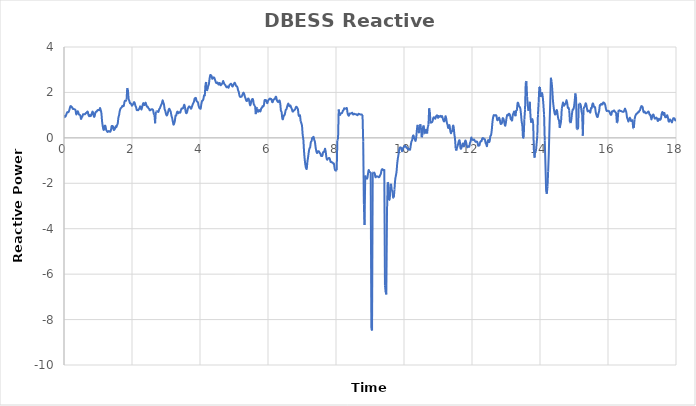
| Category | DBESS Reactive Power |
|---|---|
| 0.0 | 0.878 |
| 0.02 | 0.966 |
| 0.04 | 0.932 |
| 0.06 | 0.997 |
| 0.08 | 1.076 |
| 0.1 | 1.132 |
| 0.12 | 1.124 |
| 0.14 | 1.153 |
| 0.16 | 1.243 |
| 0.18 | 1.361 |
| 0.2 | 1.404 |
| 0.22 | 1.347 |
| 0.24 | 1.347 |
| 0.26 | 1.275 |
| 0.28 | 1.269 |
| 0.3 | 1.263 |
| 0.32 | 1.252 |
| 0.34 | 1.208 |
| 0.36 | 1.034 |
| 0.38 | 1.099 |
| 0.4 | 1.171 |
| 0.42 | 1.126 |
| 0.44 | 1.027 |
| 0.46 | 1.012 |
| 0.48 | 0.981 |
| 0.5 | 0.832 |
| 0.52 | 0.903 |
| 0.54 | 0.94 |
| 0.56 | 1.035 |
| 0.58 | 1.041 |
| 0.6 | 1.039 |
| 0.62 | 1.04 |
| 0.64 | 1.088 |
| 0.66 | 1.098 |
| 0.68 | 1.147 |
| 0.7 | 1.147 |
| 0.72 | 1.008 |
| 0.74 | 0.95 |
| 0.76 | 1.01 |
| 0.78 | 0.957 |
| 0.8 | 0.99 |
| 0.82 | 1.088 |
| 0.84 | 1.162 |
| 0.86 | 1.098 |
| 0.88 | 0.935 |
| 0.9 | 0.951 |
| 0.92 | 1.085 |
| 0.94 | 1.15 |
| 0.96 | 1.156 |
| 0.98 | 1.206 |
| 1.0 | 1.229 |
| 1.02 | 1.222 |
| 1.04 | 1.222 |
| 1.06 | 1.32 |
| 1.08 | 1.219 |
| 1.1 | 1.084 |
| 1.12 | 0.727 |
| 1.14 | 0.509 |
| 1.16 | 0.364 |
| 1.18 | 0.369 |
| 1.2 | 0.525 |
| 1.22 | 0.511 |
| 1.24 | 0.357 |
| 1.26 | 0.303 |
| 1.28 | 0.26 |
| 1.3 | 0.276 |
| 1.32 | 0.302 |
| 1.34 | 0.28 |
| 1.36 | 0.267 |
| 1.38 | 0.333 |
| 1.4 | 0.508 |
| 1.42 | 0.522 |
| 1.44 | 0.502 |
| 1.46 | 0.357 |
| 1.48 | 0.357 |
| 1.5 | 0.407 |
| 1.52 | 0.507 |
| 1.54 | 0.47 |
| 1.56 | 0.559 |
| 1.58 | 0.63 |
| 1.6 | 0.886 |
| 1.62 | 1.002 |
| 1.64 | 1.183 |
| 1.66 | 1.277 |
| 1.68 | 1.32 |
| 1.7 | 1.352 |
| 1.72 | 1.408 |
| 1.74 | 1.396 |
| 1.76 | 1.419 |
| 1.78 | 1.59 |
| 1.8 | 1.637 |
| 1.82 | 1.63 |
| 1.84 | 1.674 |
| 1.86 | 2.188 |
| 1.88 | 2.115 |
| 1.9 | 1.73 |
| 1.92 | 1.637 |
| 1.94 | 1.529 |
| 1.96 | 1.518 |
| 1.98 | 1.475 |
| 2.0 | 1.413 |
| 2.02 | 1.462 |
| 2.04 | 1.506 |
| 2.06 | 1.574 |
| 2.08 | 1.532 |
| 2.1 | 1.416 |
| 2.12 | 1.346 |
| 2.14 | 1.229 |
| 2.16 | 1.227 |
| 2.18 | 1.216 |
| 2.2 | 1.255 |
| 2.22 | 1.296 |
| 2.24 | 1.39 |
| 2.26 | 1.311 |
| 2.28 | 1.25 |
| 2.3 | 1.369 |
| 2.32 | 1.484 |
| 2.34 | 1.529 |
| 2.36 | 1.449 |
| 2.38 | 1.465 |
| 2.4 | 1.552 |
| 2.42 | 1.458 |
| 2.44 | 1.376 |
| 2.46 | 1.373 |
| 2.48 | 1.313 |
| 2.5 | 1.282 |
| 2.52 | 1.215 |
| 2.54 | 1.216 |
| 2.56 | 1.252 |
| 2.58 | 1.253 |
| 2.6 | 1.255 |
| 2.62 | 1.217 |
| 2.64 | 1.062 |
| 2.66 | 1.024 |
| 2.68 | 0.639 |
| 2.7 | 1.142 |
| 2.72 | 1.165 |
| 2.74 | 1.174 |
| 2.76 | 1.151 |
| 2.78 | 1.146 |
| 2.8 | 1.266 |
| 2.82 | 1.302 |
| 2.84 | 1.383 |
| 2.86 | 1.455 |
| 2.88 | 1.523 |
| 2.9 | 1.652 |
| 2.92 | 1.562 |
| 2.94 | 1.472 |
| 2.96 | 1.265 |
| 2.98 | 1.185 |
| 3.0 | 1.056 |
| 3.02 | 0.987 |
| 3.04 | 1.022 |
| 3.06 | 1.133 |
| 3.08 | 1.245 |
| 3.1 | 1.281 |
| 3.12 | 1.208 |
| 3.14 | 1.143 |
| 3.16 | 0.972 |
| 3.18 | 0.877 |
| 3.2 | 0.715 |
| 3.22 | 0.584 |
| 3.24 | 0.633 |
| 3.26 | 0.748 |
| 3.28 | 0.974 |
| 3.3 | 0.982 |
| 3.32 | 1.113 |
| 3.34 | 1.156 |
| 3.36 | 1.086 |
| 3.38 | 1.119 |
| 3.4 | 1.126 |
| 3.42 | 1.113 |
| 3.44 | 1.22 |
| 3.46 | 1.292 |
| 3.48 | 1.292 |
| 3.5 | 1.306 |
| 3.52 | 1.388 |
| 3.54 | 1.458 |
| 3.56 | 1.331 |
| 3.58 | 1.137 |
| 3.6 | 1.08 |
| 3.62 | 1.129 |
| 3.64 | 1.268 |
| 3.66 | 1.342 |
| 3.68 | 1.382 |
| 3.7 | 1.372 |
| 3.72 | 1.318 |
| 3.74 | 1.284 |
| 3.76 | 1.361 |
| 3.78 | 1.452 |
| 3.8 | 1.525 |
| 3.82 | 1.578 |
| 3.84 | 1.721 |
| 3.86 | 1.751 |
| 3.88 | 1.751 |
| 3.9 | 1.625 |
| 3.92 | 1.592 |
| 3.94 | 1.554 |
| 3.96 | 1.409 |
| 3.98 | 1.319 |
| 4.0 | 1.297 |
| 4.02 | 1.29 |
| 4.04 | 1.496 |
| 4.06 | 1.623 |
| 4.08 | 1.641 |
| 4.1 | 1.713 |
| 4.12 | 1.867 |
| 4.14 | 1.831 |
| 4.16 | 2.347 |
| 4.18 | 2.458 |
| 4.2 | 2.07 |
| 4.22 | 2.124 |
| 4.24 | 2.276 |
| 4.26 | 2.355 |
| 4.28 | 2.592 |
| 4.3 | 2.757 |
| 4.32 | 2.757 |
| 4.34 | 2.723 |
| 4.36 | 2.605 |
| 4.38 | 2.618 |
| 4.4 | 2.66 |
| 4.42 | 2.645 |
| 4.44 | 2.564 |
| 4.46 | 2.475 |
| 4.48 | 2.411 |
| 4.5 | 2.425 |
| 4.52 | 2.432 |
| 4.54 | 2.352 |
| 4.56 | 2.372 |
| 4.58 | 2.418 |
| 4.6 | 2.325 |
| 4.62 | 2.326 |
| 4.64 | 2.367 |
| 4.66 | 2.409 |
| 4.68 | 2.504 |
| 4.7 | 2.434 |
| 4.72 | 2.367 |
| 4.74 | 2.33 |
| 4.76 | 2.279 |
| 4.78 | 2.227 |
| 4.8 | 2.25 |
| 4.82 | 2.255 |
| 4.84 | 2.208 |
| 4.86 | 2.302 |
| 4.88 | 2.346 |
| 4.9 | 2.376 |
| 4.92 | 2.375 |
| 4.94 | 2.29 |
| 4.96 | 2.261 |
| 4.98 | 2.325 |
| 5.0 | 2.385 |
| 5.02 | 2.43 |
| 5.04 | 2.378 |
| 5.06 | 2.291 |
| 5.08 | 2.27 |
| 5.1 | 2.229 |
| 5.12 | 2.099 |
| 5.14 | 2.022 |
| 5.16 | 1.867 |
| 5.18 | 1.805 |
| 5.2 | 1.812 |
| 5.22 | 1.812 |
| 5.24 | 1.861 |
| 5.26 | 1.946 |
| 5.28 | 1.992 |
| 5.3 | 1.928 |
| 5.32 | 1.812 |
| 5.34 | 1.732 |
| 5.36 | 1.645 |
| 5.38 | 1.622 |
| 5.4 | 1.688 |
| 5.42 | 1.738 |
| 5.44 | 1.688 |
| 5.46 | 1.516 |
| 5.48 | 1.43 |
| 5.5 | 1.538 |
| 5.52 | 1.671 |
| 5.54 | 1.708 |
| 5.56 | 1.687 |
| 5.58 | 1.498 |
| 5.6 | 1.433 |
| 5.62 | 1.411 |
| 5.64 | 1.045 |
| 5.66 | 1.341 |
| 5.68 | 1.293 |
| 5.7 | 1.159 |
| 5.72 | 1.164 |
| 5.74 | 1.226 |
| 5.76 | 1.186 |
| 5.78 | 1.171 |
| 5.8 | 1.294 |
| 5.82 | 1.319 |
| 5.84 | 1.393 |
| 5.86 | 1.377 |
| 5.88 | 1.445 |
| 5.9 | 1.653 |
| 5.92 | 1.663 |
| 5.94 | 1.661 |
| 5.96 | 1.591 |
| 5.98 | 1.527 |
| 6.0 | 1.624 |
| 6.02 | 1.675 |
| 6.04 | 1.709 |
| 6.06 | 1.732 |
| 6.08 | 1.702 |
| 6.1 | 1.703 |
| 6.12 | 1.582 |
| 6.14 | 1.582 |
| 6.16 | 1.669 |
| 6.18 | 1.699 |
| 6.2 | 1.712 |
| 6.22 | 1.79 |
| 6.24 | 1.804 |
| 6.26 | 1.662 |
| 6.28 | 1.601 |
| 6.3 | 1.571 |
| 6.32 | 1.617 |
| 6.34 | 1.645 |
| 6.36 | 1.51 |
| 6.38 | 1.196 |
| 6.4 | 1.139 |
| 6.42 | 0.863 |
| 6.44 | 0.823 |
| 6.46 | 0.968 |
| 6.48 | 0.983 |
| 6.5 | 1.068 |
| 6.52 | 1.224 |
| 6.54 | 1.252 |
| 6.56 | 1.362 |
| 6.58 | 1.459 |
| 6.6 | 1.506 |
| 6.62 | 1.41 |
| 6.64 | 1.388 |
| 6.66 | 1.426 |
| 6.68 | 1.336 |
| 6.7 | 1.274 |
| 6.72 | 1.168 |
| 6.74 | 1.161 |
| 6.76 | 1.208 |
| 6.78 | 1.226 |
| 6.8 | 1.261 |
| 6.82 | 1.353 |
| 6.84 | 1.366 |
| 6.86 | 1.315 |
| 6.88 | 1.258 |
| 6.9 | 1.007 |
| 6.92 | 0.961 |
| 6.94 | 1.024 |
| 6.96 | 0.738 |
| 6.98 | 0.65 |
| 7.0 | 0.528 |
| 7.02 | 0.138 |
| 7.04 | -0.087 |
| 7.06 | -0.588 |
| 7.08 | -0.95 |
| 7.1 | -1.198 |
| 7.12 | -1.338 |
| 7.14 | -1.351 |
| 7.16 | -1.045 |
| 7.18 | -0.842 |
| 7.2 | -0.612 |
| 7.22 | -0.463 |
| 7.24 | -0.41 |
| 7.26 | -0.19 |
| 7.28 | -0.148 |
| 7.3 | -0.006 |
| 7.32 | -0.001 |
| 7.34 | 0.043 |
| 7.36 | -0.092 |
| 7.38 | -0.176 |
| 7.4 | -0.41 |
| 7.42 | -0.579 |
| 7.44 | -0.671 |
| 7.46 | -0.6 |
| 7.48 | -0.586 |
| 7.5 | -0.599 |
| 7.52 | -0.672 |
| 7.54 | -0.684 |
| 7.56 | -0.791 |
| 7.58 | -0.797 |
| 7.6 | -0.785 |
| 7.62 | -0.637 |
| 7.64 | -0.621 |
| 7.66 | -0.575 |
| 7.68 | -0.48 |
| 7.7 | -0.648 |
| 7.72 | -0.883 |
| 7.74 | -0.962 |
| 7.76 | -0.922 |
| 7.78 | -0.897 |
| 7.8 | -0.887 |
| 7.82 | -0.932 |
| 7.84 | -1.056 |
| 7.86 | -1.056 |
| 7.88 | -1.082 |
| 7.9 | -1.087 |
| 7.92 | -1.131 |
| 7.94 | -1.147 |
| 7.96 | -1.353 |
| 7.98 | -1.428 |
| 8.0 | -1.442 |
| 8.02 | -1.426 |
| 8.04 | -0.112 |
| 8.06 | -0.062 |
| 8.08 | 1.251 |
| 8.1 | 1.021 |
| 8.12 | 1.005 |
| 8.14 | 1.074 |
| 8.16 | 1.088 |
| 8.18 | 1.099 |
| 8.2 | 1.19 |
| 8.22 | 1.21 |
| 8.24 | 1.3 |
| 8.26 | 1.282 |
| 8.28 | 1.288 |
| 8.3 | 1.304 |
| 8.32 | 1.302 |
| 8.34 | 1.088 |
| 8.36 | 1.001 |
| 8.38 | 0.978 |
| 8.4 | 1.069 |
| 8.42 | 1.066 |
| 8.44 | 1.073 |
| 8.46 | 1.087 |
| 8.48 | 1.104 |
| 8.5 | 1.033 |
| 8.52 | 1.038 |
| 8.54 | 1.058 |
| 8.56 | 1.041 |
| 8.58 | 1.04 |
| 8.6 | 1.034 |
| 8.62 | 1.004 |
| 8.64 | 1.004 |
| 8.66 | 1.056 |
| 8.68 | 1.052 |
| 8.7 | 1.039 |
| 8.72 | 1.03 |
| 8.74 | 1.03 |
| 8.76 | 1.025 |
| 8.78 | 1.003 |
| 8.8 | -0.155 |
| 8.82 | -2.933 |
| 8.84 | -3.838 |
| 8.86 | -1.66 |
| 8.88 | -1.788 |
| 8.9 | -1.788 |
| 8.92 | -1.783 |
| 8.94 | -1.595 |
| 8.96 | -1.419 |
| 8.98 | -1.483 |
| 9.0 | -1.509 |
| 9.02 | -1.509 |
| 9.04 | -8.409 |
| 9.06 | -8.478 |
| 9.08 | -1.54 |
| 9.1 | -1.515 |
| 9.12 | -1.531 |
| 9.14 | -1.568 |
| 9.16 | -1.735 |
| 9.18 | -1.692 |
| 9.2 | -1.702 |
| 9.22 | -1.697 |
| 9.24 | -1.708 |
| 9.26 | -1.736 |
| 9.28 | -1.711 |
| 9.3 | -1.639 |
| 9.32 | -1.572 |
| 9.34 | -1.421 |
| 9.36 | -1.377 |
| 9.38 | -1.404 |
| 9.4 | -1.425 |
| 9.42 | -1.38 |
| 9.44 | -6.492 |
| 9.46 | -6.787 |
| 9.48 | -6.893 |
| 9.5 | -3.263 |
| 9.52 | -1.956 |
| 9.54 | -2.004 |
| 9.56 | -2.75 |
| 9.58 | -2.724 |
| 9.6 | -2.148 |
| 9.62 | -2.023 |
| 9.64 | -2.293 |
| 9.66 | -2.364 |
| 9.68 | -2.621 |
| 9.7 | -2.63 |
| 9.72 | -2.273 |
| 9.74 | -1.862 |
| 9.76 | -1.671 |
| 9.78 | -1.5 |
| 9.8 | -1.142 |
| 9.82 | -0.899 |
| 9.84 | -0.718 |
| 9.86 | -0.502 |
| 9.88 | -0.426 |
| 9.9 | -0.426 |
| 9.92 | -0.449 |
| 9.94 | -0.588 |
| 9.96 | -0.532 |
| 9.98 | -0.437 |
| 10.0 | -0.405 |
| 10.02 | -0.352 |
| 10.04 | -0.362 |
| 10.06 | -0.403 |
| 10.08 | -0.442 |
| 10.1 | -0.458 |
| 10.12 | -0.518 |
| 10.14 | -0.49 |
| 10.16 | -0.509 |
| 10.18 | -0.514 |
| 10.2 | -0.316 |
| 10.22 | -0.16 |
| 10.24 | -0.093 |
| 10.26 | 0.069 |
| 10.28 | 0.105 |
| 10.3 | -0.016 |
| 10.32 | -0.064 |
| 10.34 | -0.131 |
| 10.36 | 0.027 |
| 10.38 | 0.368 |
| 10.4 | 0.572 |
| 10.42 | 0.314 |
| 10.44 | 0.239 |
| 10.46 | 0.408 |
| 10.48 | 0.599 |
| 10.5 | 0.444 |
| 10.52 | 0.026 |
| 10.54 | 0.104 |
| 10.56 | 0.452 |
| 10.58 | 0.546 |
| 10.6 | 0.186 |
| 10.62 | 0.188 |
| 10.64 | 0.342 |
| 10.66 | 0.338 |
| 10.68 | 0.192 |
| 10.7 | 0.484 |
| 10.72 | 0.578 |
| 10.74 | 1.301 |
| 10.76 | 1.158 |
| 10.78 | 0.638 |
| 10.8 | 0.72 |
| 10.82 | 0.685 |
| 10.84 | 0.738 |
| 10.86 | 0.873 |
| 10.88 | 0.908 |
| 10.9 | 0.881 |
| 10.92 | 0.843 |
| 10.94 | 0.934 |
| 10.96 | 0.982 |
| 10.98 | 0.982 |
| 11.0 | 0.881 |
| 11.02 | 0.958 |
| 11.04 | 0.93 |
| 11.06 | 0.942 |
| 11.08 | 0.969 |
| 11.1 | 0.917 |
| 11.12 | 0.956 |
| 11.14 | 0.852 |
| 11.16 | 0.76 |
| 11.18 | 0.722 |
| 11.2 | 0.783 |
| 11.22 | 0.953 |
| 11.24 | 0.86 |
| 11.26 | 0.672 |
| 11.28 | 0.579 |
| 11.3 | 0.434 |
| 11.32 | 0.509 |
| 11.34 | 0.551 |
| 11.36 | 0.313 |
| 11.38 | 0.199 |
| 11.4 | 0.281 |
| 11.42 | 0.309 |
| 11.44 | 0.527 |
| 11.46 | 0.483 |
| 11.48 | 0.173 |
| 11.5 | -0.046 |
| 11.52 | -0.473 |
| 11.54 | -0.559 |
| 11.56 | -0.425 |
| 11.58 | -0.339 |
| 11.6 | -0.213 |
| 11.62 | -0.116 |
| 11.64 | -0.139 |
| 11.66 | -0.441 |
| 11.68 | -0.475 |
| 11.7 | -0.398 |
| 11.72 | -0.272 |
| 11.74 | -0.259 |
| 11.76 | -0.377 |
| 11.78 | -0.297 |
| 11.8 | -0.129 |
| 11.82 | -0.156 |
| 11.84 | -0.292 |
| 11.86 | -0.412 |
| 11.88 | -0.387 |
| 11.9 | -0.37 |
| 11.92 | -0.386 |
| 11.94 | -0.225 |
| 11.96 | -0.151 |
| 11.98 | 0.013 |
| 12.0 | -0.065 |
| 12.02 | -0.091 |
| 12.04 | -0.088 |
| 12.06 | -0.074 |
| 12.08 | -0.12 |
| 12.1 | -0.168 |
| 12.12 | -0.176 |
| 12.14 | -0.159 |
| 12.16 | -0.2 |
| 12.18 | -0.341 |
| 12.2 | -0.317 |
| 12.22 | -0.329 |
| 12.24 | -0.189 |
| 12.26 | -0.143 |
| 12.28 | -0.146 |
| 12.3 | -0.032 |
| 12.32 | -0.008 |
| 12.34 | -0.025 |
| 12.36 | -0.06 |
| 12.38 | -0.073 |
| 12.4 | -0.224 |
| 12.42 | -0.289 |
| 12.44 | -0.366 |
| 12.46 | -0.156 |
| 12.48 | -0.099 |
| 12.5 | -0.185 |
| 12.52 | -0.136 |
| 12.54 | 0.078 |
| 12.56 | 0.118 |
| 12.58 | 0.321 |
| 12.6 | 0.665 |
| 12.62 | 0.891 |
| 12.64 | 1 |
| 12.66 | 0.981 |
| 12.68 | 0.981 |
| 12.7 | 1.001 |
| 12.72 | 0.97 |
| 12.74 | 0.791 |
| 12.76 | 0.782 |
| 12.78 | 0.839 |
| 12.8 | 0.889 |
| 12.82 | 0.78 |
| 12.84 | 0.623 |
| 12.86 | 0.617 |
| 12.88 | 0.659 |
| 12.9 | 0.852 |
| 12.92 | 0.852 |
| 12.94 | 0.754 |
| 12.96 | 0.601 |
| 12.98 | 0.537 |
| 13.0 | 0.71 |
| 13.02 | 0.916 |
| 13.04 | 1.017 |
| 13.06 | 0.987 |
| 13.08 | 1.053 |
| 13.1 | 1.051 |
| 13.12 | 0.982 |
| 13.14 | 0.825 |
| 13.16 | 0.812 |
| 13.18 | 0.768 |
| 13.2 | 1.011 |
| 13.22 | 1.083 |
| 13.24 | 1.159 |
| 13.26 | 1.046 |
| 13.28 | 0.954 |
| 13.3 | 1.229 |
| 13.32 | 1.229 |
| 13.34 | 1.525 |
| 13.36 | 1.526 |
| 13.38 | 1.411 |
| 13.4 | 1.365 |
| 13.42 | 1.304 |
| 13.44 | 1.064 |
| 13.46 | 0.724 |
| 13.48 | 0.566 |
| 13.5 | -0.019 |
| 13.52 | 0.015 |
| 13.54 | 0.815 |
| 13.56 | 1.241 |
| 13.58 | 2.432 |
| 13.6 | 2.494 |
| 13.62 | 1.825 |
| 13.64 | 1.432 |
| 13.66 | 1.192 |
| 13.68 | 1.324 |
| 13.7 | 1.586 |
| 13.72 | 0.961 |
| 13.74 | 0.67 |
| 13.76 | 0.844 |
| 13.78 | 0.814 |
| 13.8 | 0.612 |
| 13.82 | -0.538 |
| 13.84 | -0.871 |
| 13.86 | -0.559 |
| 13.88 | -0.559 |
| 13.9 | -0.255 |
| 13.92 | 0.092 |
| 13.94 | 1.029 |
| 13.96 | 1.567 |
| 13.98 | 2.238 |
| 14.0 | 2.238 |
| 14.02 | 1.802 |
| 14.04 | 1.922 |
| 14.06 | 1.97 |
| 14.08 | 1.815 |
| 14.1 | 1.464 |
| 14.12 | 1.016 |
| 14.14 | -0.12 |
| 14.16 | -1.166 |
| 14.18 | -2.335 |
| 14.2 | -2.464 |
| 14.22 | -2.155 |
| 14.24 | -1.469 |
| 14.26 | -0.622 |
| 14.28 | 0.55 |
| 14.3 | 1.506 |
| 14.32 | 2.646 |
| 14.34 | 2.484 |
| 14.36 | 2.148 |
| 14.38 | 1.664 |
| 14.4 | 1.373 |
| 14.42 | 1.155 |
| 14.44 | 1.028 |
| 14.46 | 1.07 |
| 14.48 | 1.19 |
| 14.5 | 1.208 |
| 14.52 | 0.994 |
| 14.54 | 0.828 |
| 14.56 | 0.758 |
| 14.58 | 0.436 |
| 14.6 | 0.57 |
| 14.62 | 0.757 |
| 14.64 | 1.28 |
| 14.66 | 1.444 |
| 14.68 | 1.557 |
| 14.7 | 1.42 |
| 14.72 | 1.445 |
| 14.74 | 1.491 |
| 14.76 | 1.53 |
| 14.78 | 1.666 |
| 14.8 | 1.534 |
| 14.82 | 1.323 |
| 14.84 | 1.323 |
| 14.86 | 1.216 |
| 14.88 | 0.694 |
| 14.9 | 0.653 |
| 14.92 | 0.789 |
| 14.94 | 1.053 |
| 14.96 | 1.24 |
| 14.98 | 1.254 |
| 15.0 | 1.366 |
| 15.02 | 1.624 |
| 15.04 | 1.956 |
| 15.06 | 1.802 |
| 15.08 | 0.403 |
| 15.1 | 0.379 |
| 15.12 | 0.379 |
| 15.14 | 1.503 |
| 15.16 | 1.503 |
| 15.18 | 1.502 |
| 15.2 | 1.429 |
| 15.22 | 1.183 |
| 15.24 | 1.016 |
| 15.26 | 0.097 |
| 15.28 | 1.243 |
| 15.3 | 1.379 |
| 15.32 | 1.391 |
| 15.34 | 1.518 |
| 15.36 | 1.476 |
| 15.38 | 1.304 |
| 15.4 | 1.174 |
| 15.42 | 1.183 |
| 15.44 | 1.199 |
| 15.46 | 1.164 |
| 15.48 | 1.115 |
| 15.5 | 1.306 |
| 15.52 | 1.308 |
| 15.54 | 1.476 |
| 15.56 | 1.516 |
| 15.58 | 1.419 |
| 15.6 | 1.347 |
| 15.62 | 1.341 |
| 15.64 | 1.119 |
| 15.66 | 1.009 |
| 15.68 | 0.923 |
| 15.7 | 0.931 |
| 15.72 | 1.078 |
| 15.74 | 1.187 |
| 15.76 | 1.435 |
| 15.78 | 1.435 |
| 15.8 | 1.497 |
| 15.82 | 1.476 |
| 15.84 | 1.476 |
| 15.86 | 1.554 |
| 15.88 | 1.549 |
| 15.9 | 1.52 |
| 15.92 | 1.437 |
| 15.94 | 1.276 |
| 15.96 | 1.186 |
| 15.98 | 1.198 |
| 16.0 | 1.194 |
| 16.02 | 1.168 |
| 16.04 | 1.168 |
| 16.06 | 1.077 |
| 16.08 | 1.018 |
| 16.1 | 1.026 |
| 16.12 | 1.165 |
| 16.14 | 1.161 |
| 16.16 | 1.188 |
| 16.18 | 1.208 |
| 16.2 | 1.159 |
| 16.22 | 1.126 |
| 16.24 | 1.066 |
| 16.26 | 0.668 |
| 16.28 | 0.675 |
| 16.3 | 1.127 |
| 16.32 | 1.232 |
| 16.34 | 1.211 |
| 16.36 | 1.183 |
| 16.38 | 1.183 |
| 16.4 | 1.167 |
| 16.42 | 1.152 |
| 16.44 | 1.148 |
| 16.46 | 1.148 |
| 16.48 | 1.209 |
| 16.5 | 1.291 |
| 16.52 | 1.214 |
| 16.54 | 1.113 |
| 16.56 | 0.893 |
| 16.58 | 0.814 |
| 16.6 | 0.714 |
| 16.62 | 0.804 |
| 16.64 | 0.886 |
| 16.66 | 0.831 |
| 16.68 | 0.741 |
| 16.7 | 0.75 |
| 16.72 | 0.76 |
| 16.74 | 0.45 |
| 16.76 | 0.434 |
| 16.78 | 0.801 |
| 16.8 | 0.943 |
| 16.82 | 1.016 |
| 16.84 | 1.063 |
| 16.86 | 1.074 |
| 16.88 | 1.126 |
| 16.9 | 1.126 |
| 16.92 | 1.185 |
| 16.94 | 1.215 |
| 16.96 | 1.317 |
| 16.98 | 1.394 |
| 17.0 | 1.385 |
| 17.02 | 1.343 |
| 17.04 | 1.162 |
| 17.06 | 1.119 |
| 17.08 | 1.156 |
| 17.1 | 1.097 |
| 17.12 | 1.08 |
| 17.14 | 1.096 |
| 17.16 | 1.121 |
| 17.18 | 1.153 |
| 17.2 | 1.142 |
| 17.22 | 1.027 |
| 17.24 | 1.016 |
| 17.26 | 0.921 |
| 17.28 | 0.812 |
| 17.3 | 0.958 |
| 17.32 | 1.016 |
| 17.34 | 1.016 |
| 17.36 | 0.904 |
| 17.38 | 0.846 |
| 17.4 | 0.869 |
| 17.42 | 0.894 |
| 17.44 | 0.859 |
| 17.46 | 0.749 |
| 17.48 | 0.763 |
| 17.5 | 0.84 |
| 17.52 | 0.8 |
| 17.54 | 0.8 |
| 17.56 | 0.872 |
| 17.58 | 1.074 |
| 17.6 | 1.142 |
| 17.62 | 1.082 |
| 17.64 | 1.004 |
| 17.66 | 1.094 |
| 17.68 | 0.922 |
| 17.7 | 0.911 |
| 17.72 | 0.917 |
| 17.74 | 1.002 |
| 17.76 | 0.918 |
| 17.78 | 0.744 |
| 17.8 | 0.721 |
| 17.82 | 0.811 |
| 17.84 | 0.773 |
| 17.86 | 0.749 |
| 17.88 | 0.68 |
| 17.9 | 0.781 |
| 17.92 | 0.861 |
| 17.94 | 0.863 |
| 17.96 | 0.841 |
| 17.98 | 0.77 |
| 18.0 | 0.8 |